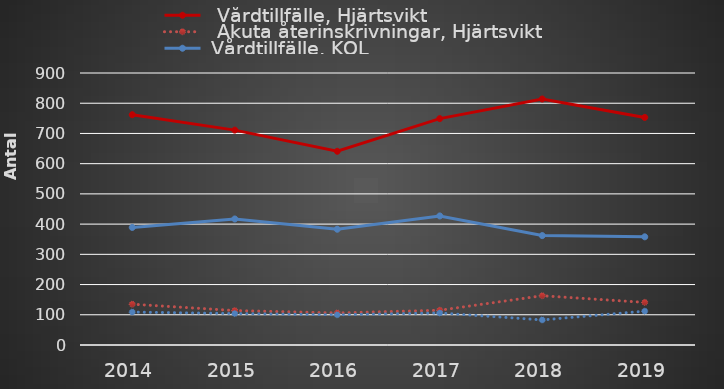
| Category |   Vårdtillfälle, Hjärtsvikt |   Akuta återinskrivningar, Hjärtsvikt |  Vårdtillfälle, KOL |   Akuta återinskrivningar, KOL |
|---|---|---|---|---|
| 2014 | 762 | 135 | 389 | 109 |
| 2015 | 711 | 114 | 417 | 104 |
| 2016 | 641 | 106 | 383 | 100 |
| 2017 | 749 | 115 | 427 | 106 |
| 2018 | 814 | 163 | 362 | 83 |
| 2019 | 753 | 141 | 358 | 112 |